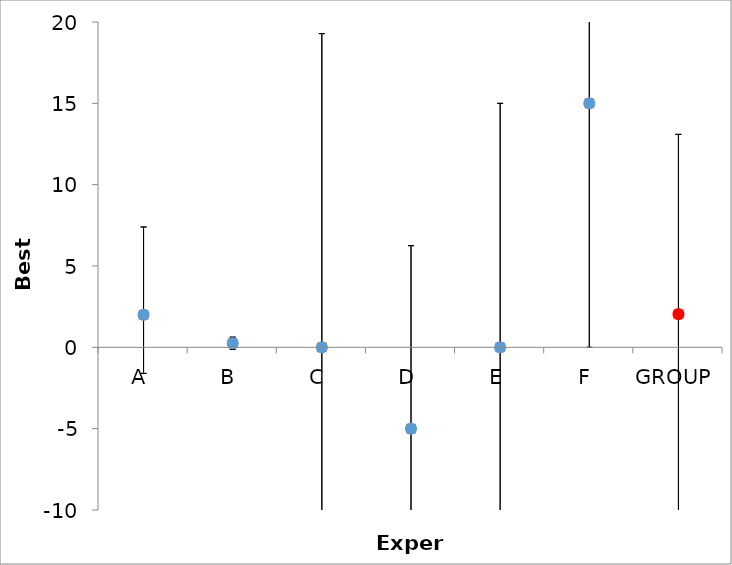
| Category | Series 1 | Series 0 |
|---|---|---|
| A | 2 | 2 |
| B | 0.25 | 0.25 |
| C | 0 | 0 |
| D | -5 | -5 |
| E | 0 | 0 |
| F | 15 | 15 |
| GROUP | 2.042 | 2.042 |